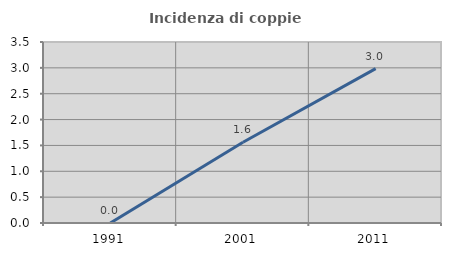
| Category | Incidenza di coppie miste |
|---|---|
| 1991.0 | 0 |
| 2001.0 | 1.562 |
| 2011.0 | 2.985 |